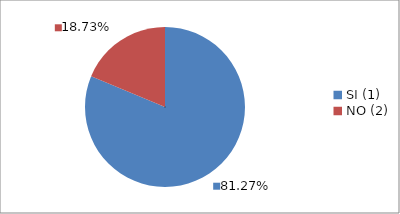
| Category | Series 0 |
|---|---|
| SI (1) | 0.813 |
| NO (2) | 0.187 |